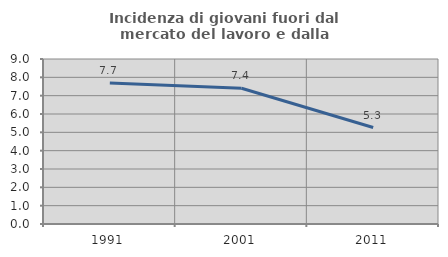
| Category | Incidenza di giovani fuori dal mercato del lavoro e dalla formazione  |
|---|---|
| 1991.0 | 7.692 |
| 2001.0 | 7.407 |
| 2011.0 | 5.263 |